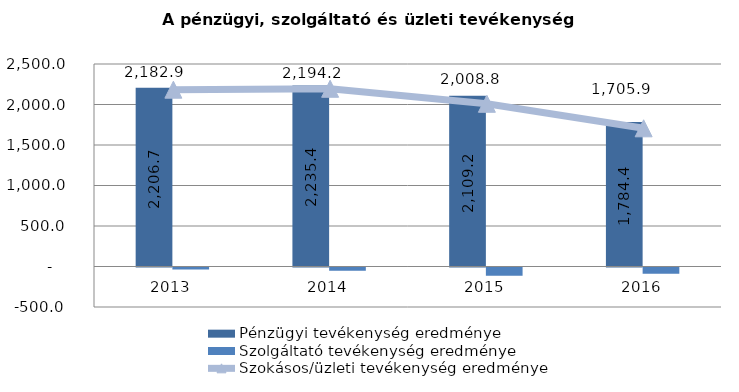
| Category | Pénzügyi tevékenység eredménye | Szolgáltató tevékenység eredménye |
|---|---|---|
| 2013.0 | 2206.7 | -23.8 |
| 2014.0 | 2235.4 | -41.2 |
| 2015.0 | 2109.233 | -100.427 |
| 2016.0 | 1784.4 | -78.5 |